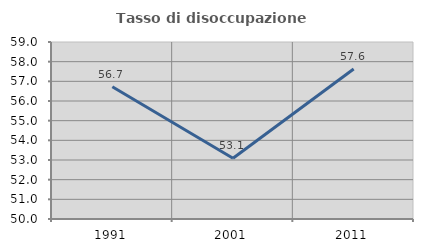
| Category | Tasso di disoccupazione giovanile  |
|---|---|
| 1991.0 | 56.725 |
| 2001.0 | 53.086 |
| 2011.0 | 57.627 |